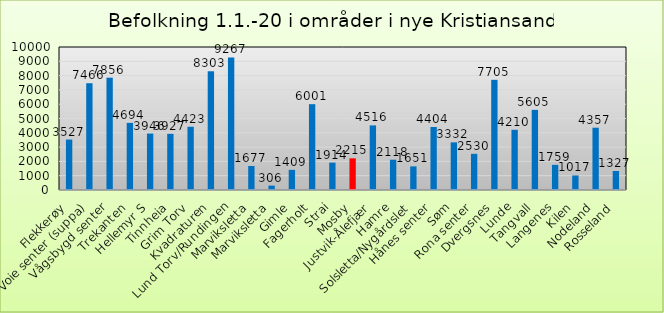
| Category | Series 0 |
|---|---|
| Flekkerøy | 3527 |
| Voie senter (suppa) | 7466 |
| Vågsbygd senter | 7856 |
| Trekanten | 4694 |
| Hellemyr S | 3946 |
| Tinnheia | 3927 |
| Grim Torv | 4423 |
| Kvadraturen | 8303 |
| Lund Torv/Rundingen | 9267 |
| Marviksletta | 1677 |
| Marviksletta | 306 |
| Gimle | 1409 |
| Fagerholt | 6001 |
| Strai | 1914 |
| Mosby | 2215 |
| Justvik-Ålefjær | 4516 |
| Hamre | 2118 |
| Solsletta/Nygårdslet | 1651 |
| Hånes senter | 4404 |
| Søm | 3332 |
| Rona senter | 2530 |
| Dvergsnes | 7705 |
| Lunde | 4210 |
| Tangvall | 5605 |
| Langenes | 1759 |
| Kilen | 1017 |
| Nodeland | 4357 |
| Rosseland | 1327 |